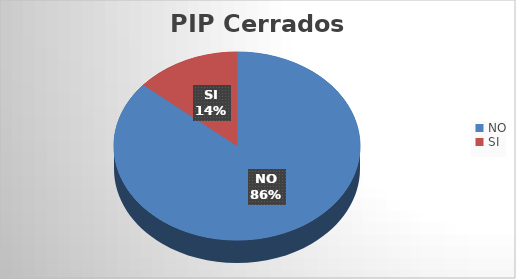
| Category | N° | Costo Total |
|---|---|---|
| NO | 538 | 3311557649.78 |
| SI | 86 | 201190639.21 |